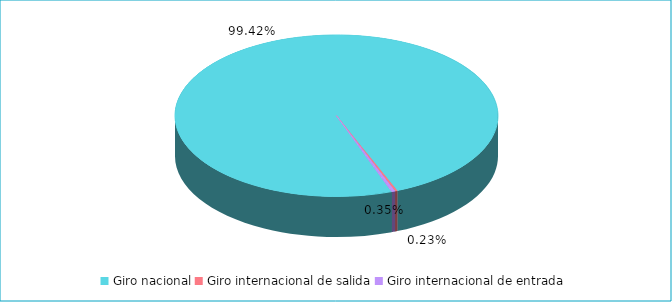
| Category | Series 0 |
|---|---|
| Giro nacional | 0.994 |
| Giro internacional de salida | 0.002 |
| Giro internacional de entrada | 0.004 |